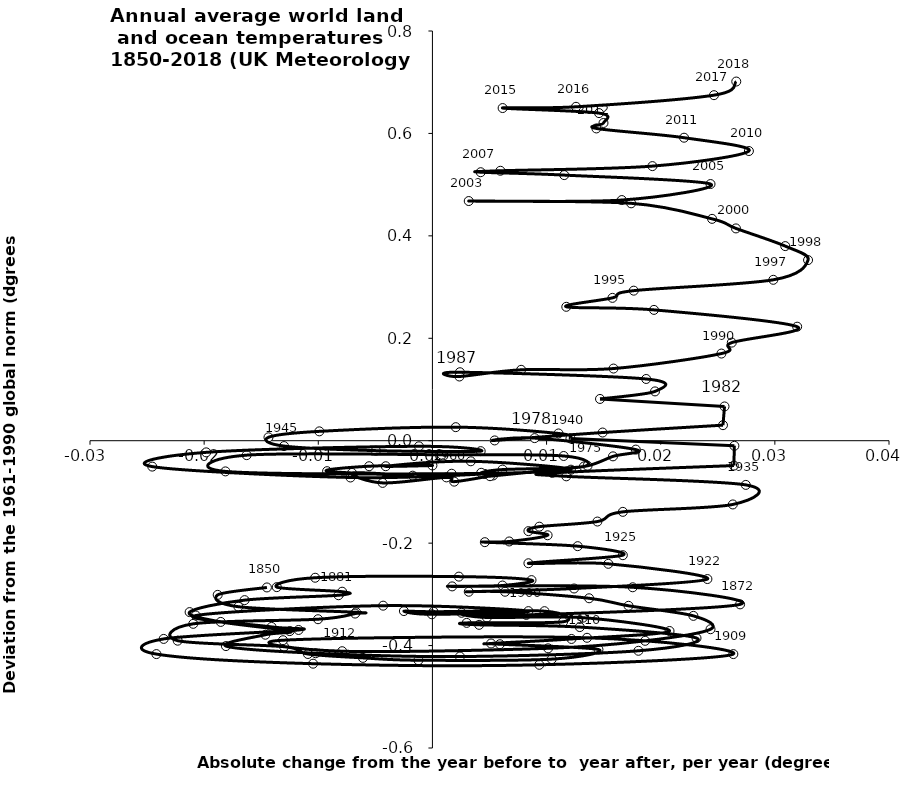
| Category | Series 0 |
|---|---|
| -0.014500000000000013 | -0.287 |
| -0.018812499999999982 | -0.301 |
| -0.016999999999999987 | -0.324 |
| -0.006687500000000013 | -0.335 |
| -0.006772727272727264 | -0.338 |
| -0.010022727272727266 | -0.349 |
| -0.020954545454545448 | -0.358 |
| -0.022318181818181793 | -0.39 |
| -0.013000000000000012 | -0.402 |
| -0.010909090909090924 | -0.416 |
| -0.006090909090909091 | -0.424 |
| -0.0012272727272727157 | -0.429 |
| 0.010454545454545439 | -0.426 |
| 0.014545454545454556 | -0.408 |
| 0.005909090909090947 | -0.397 |
| 0.005136363636363661 | -0.396 |
| 0.012181818181818183 | -0.387 |
| 0.02077272727272725 | -0.372 |
| 0.013181818181818183 | -0.346 |
| 0.004772727272727234 | -0.345 |
| 0.0025454545454544897 | -0.336 |
| 0.00822727272727275 | -0.34 |
| 0.026954545454545453 | -0.32 |
| 0.017545454545454503 | -0.286 |
| 0.0017272727272727717 | -0.284 |
| 0.006136363636363634 | -0.283 |
| 0.008681818181818152 | -0.272 |
| 0.0023181818181818303 | -0.265 |
| -0.010272727272727239 | -0.268 |
| -0.013636363636363613 | -0.286 |
| -0.007909090909090921 | -0.295 |
| -0.00822727272727275 | -0.302 |
| -0.01645454545454547 | -0.311 |
| -0.021272727272727276 | -0.335 |
| -0.01854545454545453 | -0.354 |
| -0.012499999999999956 | -0.372 |
| -0.014636363636363642 | -0.379 |
| -0.01809090909090913 | -0.401 |
| -0.010227272727272751 | -0.415 |
| 0.0024090909090909163 | -0.421 |
| 0.018045454545454614 | -0.41 |
| 0.02313636363636365 | -0.385 |
| 0.01290909090909087 | -0.364 |
| 0.0040909090909090895 | -0.36 |
| 0.0030000000000000027 | -0.356 |
| 0.01145454545454544 | -0.354 |
| 0.00981818181818181 | -0.333 |
| 9.090909090908594e-05 | -0.334 |
| -0.0024999999999999745 | -0.333 |
| -4.545454545454297e-05 | -0.339 |
| 0.008409090909090894 | -0.333 |
| -0.004318181818181777 | -0.322 |
| -0.020727272727272705 | -0.341 |
| -0.014090909090909098 | -0.364 |
| -0.011727272727272725 | -0.37 |
| -0.023545454545454564 | -0.387 |
| -0.024181818181818193 | -0.417 |
| -0.010454545454545494 | -0.435 |
| 0.009363636363636352 | -0.438 |
| 0.026363636363636367 | -0.417 |
| 0.013545454545454527 | -0.385 |
| -0.013090909090909097 | -0.39 |
| -0.007909090909090921 | -0.411 |
| 0.010136363636363666 | -0.405 |
| 0.018636363636363645 | -0.391 |
| 0.024363636363636365 | -0.368 |
| 0.022863636363636364 | -0.342 |
| 0.017181818181818187 | -0.322 |
| 0.013727272727272727 | -0.308 |
| 0.006363636363636349 | -0.295 |
| 0.0031818181818182023 | -0.295 |
| 0.012409090909090925 | -0.289 |
| 0.024090909090909093 | -0.27 |
| 0.015409090909090914 | -0.24 |
| 0.008409090909090908 | -0.239 |
| 0.016681818181818173 | -0.224 |
| 0.012727272727272712 | -0.206 |
| 0.00459090909090909 | -0.198 |
| 0.0067272727272727345 | -0.197 |
| 0.010090909090909095 | -0.185 |
| 0.008409090909090908 | -0.177 |
| 0.009363636363636366 | -0.168 |
| 0.014454545454545456 | -0.158 |
| 0.0166818181818182 | -0.139 |
| 0.026318181818181845 | -0.124 |
| 0.027454545454545447 | -0.086 |
| 0.011727272727272711 | -0.07 |
| 0.010499999999999999 | -0.063 |
| 0.02640909090909091 | -0.049 |
| 0.026454545454545453 | -0.01 |
| 0.01209090909090909 | 0.004 |
| 0.011045454545454546 | 0.014 |
| 0.0020454545454545447 | 0.026 |
| -0.009909090909090907 | 0.018 |
| -0.014363636363636363 | 0.007 |
| -0.013000000000000003 | -0.01 |
| -0.004954545454545455 | -0.019 |
| 0.004227272727272726 | -0.02 |
| -0.0011818181818181867 | -0.011 |
| -0.019818181818181825 | -0.023 |
| -0.024545454545454544 | -0.051 |
| -0.007181818181818178 | -0.072 |
| 0.00459090909090909 | -0.065 |
| 0.004272727272727275 | -0.063 |
| 0.006136363636363641 | -0.056 |
| 0.013272727272727278 | -0.05 |
| 0.011500000000000002 | -0.03 |
| 0.0008181818181818169 | -0.027 |
| -0.016272727272727272 | -0.028 |
| -0.018136363636363634 | -0.06 |
| 0.0016818181818181836 | -0.064 |
| 0.012136363636363633 | -0.057 |
| 0.003363636363636364 | -0.04 |
| -0.0040909090909090895 | -0.05 |
| 0.0 | -0.048 |
| -0.005545454545454544 | -0.05 |
| -0.009227272727272726 | -0.059 |
| -0.0017272727272727266 | -0.068 |
| -0.007045454545454549 | -0.063 |
| -0.004363636363636368 | -0.082 |
| 0.0012272727272727227 | -0.072 |
| 0.001909090909090909 | -0.08 |
| 0.005318181818181819 | -0.068 |
| 0.005045454545454544 | -0.069 |
| 0.010136363636363638 | -0.058 |
| 0.013590909090909096 | -0.049 |
| 0.01581818181818182 | -0.031 |
| 0.017818181818181816 | -0.017 |
| 0.008954545454545455 | 0.005 |
| 0.005454545454545453 | 0.001 |
| 0.014909090909090907 | 0.016 |
| 0.025454545454545452 | 0.03 |
| 0.025590909090909095 | 0.067 |
| 0.014681818181818185 | 0.082 |
| 0.019500000000000003 | 0.096 |
| 0.018727272727272724 | 0.121 |
| 0.0024090909090909093 | 0.134 |
| 0.0023636363636363594 | 0.125 |
| 0.0077727272727272645 | 0.138 |
| 0.01586363636363637 | 0.141 |
| 0.025318181818181837 | 0.17 |
| 0.026227272727272738 | 0.192 |
| 0.03195454545454546 | 0.223 |
| 0.01940909090909089 | 0.255 |
| 0.011727272727272725 | 0.261 |
| 0.01577272727272727 | 0.279 |
| 0.01763636363636359 | 0.293 |
| 0.02986363636363637 | 0.314 |
| 0.032909090909090916 | 0.353 |
| 0.030909090909090886 | 0.38 |
| 0.02659090909090911 | 0.415 |
| 0.024500000000000022 | 0.433 |
| 0.017409090909090902 | 0.464 |
| 0.0031818181818182023 | 0.468 |
| 0.0165909090909091 | 0.47 |
| 0.024363636363636365 | 0.501 |
| 0.011545454545454581 | 0.519 |
| 0.004227272727272746 | 0.524 |
| 0.005954545454545435 | 0.527 |
| 0.019272727272727275 | 0.536 |
| 0.027727272727272767 | 0.566 |
| 0.022045454545454535 | 0.592 |
| 0.0143636363636363 | 0.61 |
| 0.014986363636363631 | 0.62 |
| 0.014595959595959551 | 0.64 |
| 0.006149999999999989 | 0.65 |
| 0.012579365079365135 | 0.652 |
| 0.02466666666666667 | 0.675 |
| 0.026619047619047653 | 0.701 |